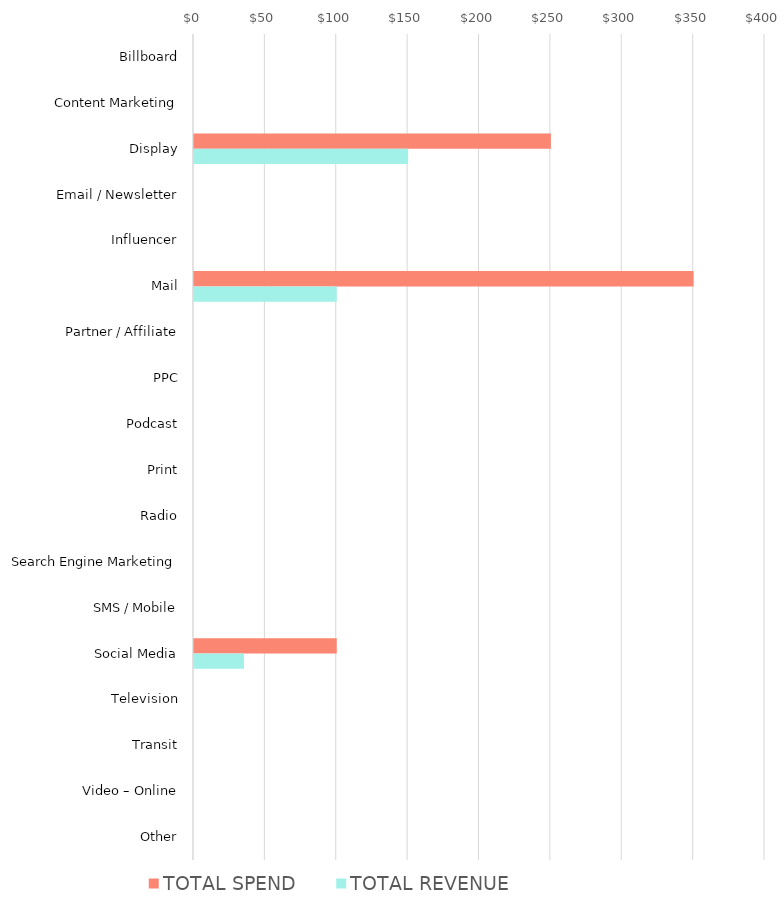
| Category | TOTAL SPEND | TOTAL REVENUE |
|---|---|---|
| Billboard | 0 | 0 |
| Content Marketing | 0 | 0 |
| Display | 250 | 150 |
| Email / Newsletter | 0 | 0 |
| Influencer | 0 | 0 |
| Mail | 350 | 100 |
| Partner / Affiliate | 0 | 0 |
| PPC | 0 | 0 |
| Podcast | 0 | 0 |
| Print | 0 | 0 |
| Radio | 0 | 0 |
| Search Engine Marketing | 0 | 0 |
| SMS / Mobile | 0 | 0 |
| Social Media | 100 | 35 |
| Television | 0 | 0 |
| Transit | 0 | 0 |
| Video – Online | 0 | 0 |
| Other | 0 | 0 |